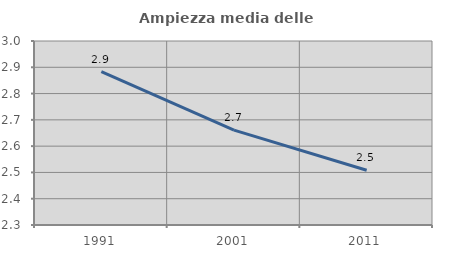
| Category | Ampiezza media delle famiglie |
|---|---|
| 1991.0 | 2.883 |
| 2001.0 | 2.661 |
| 2011.0 | 2.508 |